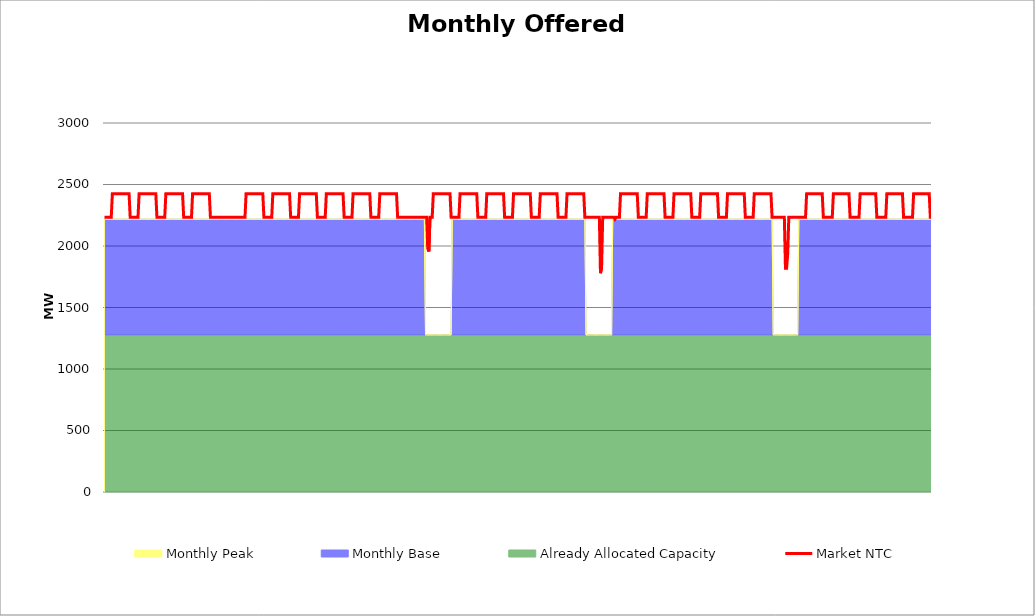
| Category | Market NTC |
|---|---|
| 0 | 2233 |
| 1 | 2233 |
| 2 | 2233 |
| 3 | 2233 |
| 4 | 2233 |
| 5 | 2233 |
| 6 | 2233 |
| 7 | 2425 |
| 8 | 2425 |
| 9 | 2425 |
| 10 | 2425 |
| 11 | 2425 |
| 12 | 2425 |
| 13 | 2425 |
| 14 | 2425 |
| 15 | 2425 |
| 16 | 2425 |
| 17 | 2425 |
| 18 | 2425 |
| 19 | 2425 |
| 20 | 2425 |
| 21 | 2425 |
| 22 | 2425 |
| 23 | 2233 |
| 24 | 2233 |
| 25 | 2233 |
| 26 | 2233 |
| 27 | 2233 |
| 28 | 2233 |
| 29 | 2233 |
| 30 | 2233 |
| 31 | 2425 |
| 32 | 2425 |
| 33 | 2425 |
| 34 | 2425 |
| 35 | 2425 |
| 36 | 2425 |
| 37 | 2425 |
| 38 | 2425 |
| 39 | 2425 |
| 40 | 2425 |
| 41 | 2425 |
| 42 | 2425 |
| 43 | 2425 |
| 44 | 2425 |
| 45 | 2425 |
| 46 | 2425 |
| 47 | 2233 |
| 48 | 2233 |
| 49 | 2233 |
| 50 | 2233 |
| 51 | 2233 |
| 52 | 2233 |
| 53 | 2233 |
| 54 | 2233 |
| 55 | 2425 |
| 56 | 2425 |
| 57 | 2425 |
| 58 | 2425 |
| 59 | 2425 |
| 60 | 2425 |
| 61 | 2425 |
| 62 | 2425 |
| 63 | 2425 |
| 64 | 2425 |
| 65 | 2425 |
| 66 | 2425 |
| 67 | 2425 |
| 68 | 2425 |
| 69 | 2425 |
| 70 | 2425 |
| 71 | 2233 |
| 72 | 2233 |
| 73 | 2233 |
| 74 | 2233 |
| 75 | 2233 |
| 76 | 2233 |
| 77 | 2233 |
| 78 | 2233 |
| 79 | 2425 |
| 80 | 2425 |
| 81 | 2425 |
| 82 | 2425 |
| 83 | 2425 |
| 84 | 2425 |
| 85 | 2425 |
| 86 | 2425 |
| 87 | 2425 |
| 88 | 2425 |
| 89 | 2425 |
| 90 | 2425 |
| 91 | 2425 |
| 92 | 2425 |
| 93 | 2425 |
| 94 | 2425 |
| 95 | 2233 |
| 96 | 2233 |
| 97 | 2233 |
| 98 | 2233 |
| 99 | 2233 |
| 100 | 2233 |
| 101 | 2233 |
| 102 | 2233 |
| 103 | 2233 |
| 104 | 2233 |
| 105 | 2233 |
| 106 | 2233 |
| 107 | 2233 |
| 108 | 2233 |
| 109 | 2233 |
| 110 | 2233 |
| 111 | 2233 |
| 112 | 2233 |
| 113 | 2233 |
| 114 | 2233 |
| 115 | 2233 |
| 116 | 2233 |
| 117 | 2233 |
| 118 | 2233 |
| 119 | 2233 |
| 120 | 2233 |
| 121 | 2233 |
| 122 | 2233 |
| 123 | 2233 |
| 124 | 2233 |
| 125 | 2233 |
| 126 | 2233 |
| 127 | 2425 |
| 128 | 2425 |
| 129 | 2425 |
| 130 | 2425 |
| 131 | 2425 |
| 132 | 2425 |
| 133 | 2425 |
| 134 | 2425 |
| 135 | 2425 |
| 136 | 2425 |
| 137 | 2425 |
| 138 | 2425 |
| 139 | 2425 |
| 140 | 2425 |
| 141 | 2425 |
| 142 | 2425 |
| 143 | 2233 |
| 144 | 2233 |
| 145 | 2233 |
| 146 | 2233 |
| 147 | 2233 |
| 148 | 2233 |
| 149 | 2233 |
| 150 | 2233 |
| 151 | 2425 |
| 152 | 2425 |
| 153 | 2425 |
| 154 | 2425 |
| 155 | 2425 |
| 156 | 2425 |
| 157 | 2425 |
| 158 | 2425 |
| 159 | 2425 |
| 160 | 2425 |
| 161 | 2425 |
| 162 | 2425 |
| 163 | 2425 |
| 164 | 2425 |
| 165 | 2425 |
| 166 | 2425 |
| 167 | 2233 |
| 168 | 2233 |
| 169 | 2233 |
| 170 | 2233 |
| 171 | 2233 |
| 172 | 2233 |
| 173 | 2233 |
| 174 | 2233 |
| 175 | 2425 |
| 176 | 2425 |
| 177 | 2425 |
| 178 | 2425 |
| 179 | 2425 |
| 180 | 2425 |
| 181 | 2425 |
| 182 | 2425 |
| 183 | 2425 |
| 184 | 2425 |
| 185 | 2425 |
| 186 | 2425 |
| 187 | 2425 |
| 188 | 2425 |
| 189 | 2425 |
| 190 | 2425 |
| 191 | 2233 |
| 192 | 2233 |
| 193 | 2233 |
| 194 | 2233 |
| 195 | 2233 |
| 196 | 2233 |
| 197 | 2233 |
| 198 | 2233 |
| 199 | 2425 |
| 200 | 2425 |
| 201 | 2425 |
| 202 | 2425 |
| 203 | 2425 |
| 204 | 2425 |
| 205 | 2425 |
| 206 | 2425 |
| 207 | 2425 |
| 208 | 2425 |
| 209 | 2425 |
| 210 | 2425 |
| 211 | 2425 |
| 212 | 2425 |
| 213 | 2425 |
| 214 | 2425 |
| 215 | 2233 |
| 216 | 2233 |
| 217 | 2233 |
| 218 | 2233 |
| 219 | 2233 |
| 220 | 2233 |
| 221 | 2233 |
| 222 | 2233 |
| 223 | 2425 |
| 224 | 2425 |
| 225 | 2425 |
| 226 | 2425 |
| 227 | 2425 |
| 228 | 2425 |
| 229 | 2425 |
| 230 | 2425 |
| 231 | 2425 |
| 232 | 2425 |
| 233 | 2425 |
| 234 | 2425 |
| 235 | 2425 |
| 236 | 2425 |
| 237 | 2425 |
| 238 | 2425 |
| 239 | 2233 |
| 240 | 2233 |
| 241 | 2233 |
| 242 | 2233 |
| 243 | 2233 |
| 244 | 2233 |
| 245 | 2233 |
| 246 | 2233 |
| 247 | 2425 |
| 248 | 2425 |
| 249 | 2425 |
| 250 | 2425 |
| 251 | 2425 |
| 252 | 2425 |
| 253 | 2425 |
| 254 | 2425 |
| 255 | 2425 |
| 256 | 2425 |
| 257 | 2425 |
| 258 | 2425 |
| 259 | 2425 |
| 260 | 2425 |
| 261 | 2425 |
| 262 | 2425 |
| 263 | 2233 |
| 264 | 2233 |
| 265 | 2233 |
| 266 | 2233 |
| 267 | 2233 |
| 268 | 2233 |
| 269 | 2233 |
| 270 | 2233 |
| 271 | 2233 |
| 272 | 2233 |
| 273 | 2233 |
| 274 | 2233 |
| 275 | 2233 |
| 276 | 2233 |
| 277 | 2233 |
| 278 | 2233 |
| 279 | 2233 |
| 280 | 2233 |
| 281 | 2233 |
| 282 | 2233 |
| 283 | 2233 |
| 284 | 2233 |
| 285 | 2233 |
| 286 | 2233 |
| 287 | 2233 |
| 288 | 2233 |
| 289 | 2233 |
| 290 | 1981 |
| 291 | 1955 |
| 292 | 2233 |
| 293 | 2233 |
| 294 | 2233 |
| 295 | 2425 |
| 296 | 2425 |
| 297 | 2425 |
| 298 | 2425 |
| 299 | 2425 |
| 300 | 2425 |
| 301 | 2425 |
| 302 | 2425 |
| 303 | 2425 |
| 304 | 2425 |
| 305 | 2425 |
| 306 | 2425 |
| 307 | 2425 |
| 308 | 2425 |
| 309 | 2425 |
| 310 | 2425 |
| 311 | 2233 |
| 312 | 2233 |
| 313 | 2233 |
| 314 | 2233 |
| 315 | 2233 |
| 316 | 2233 |
| 317 | 2233 |
| 318 | 2233 |
| 319 | 2425 |
| 320 | 2425 |
| 321 | 2425 |
| 322 | 2425 |
| 323 | 2425 |
| 324 | 2425 |
| 325 | 2425 |
| 326 | 2425 |
| 327 | 2425 |
| 328 | 2425 |
| 329 | 2425 |
| 330 | 2425 |
| 331 | 2425 |
| 332 | 2425 |
| 333 | 2425 |
| 334 | 2425 |
| 335 | 2233 |
| 336 | 2233 |
| 337 | 2233 |
| 338 | 2233 |
| 339 | 2233 |
| 340 | 2233 |
| 341 | 2233 |
| 342 | 2233 |
| 343 | 2425 |
| 344 | 2425 |
| 345 | 2425 |
| 346 | 2425 |
| 347 | 2425 |
| 348 | 2425 |
| 349 | 2425 |
| 350 | 2425 |
| 351 | 2425 |
| 352 | 2425 |
| 353 | 2425 |
| 354 | 2425 |
| 355 | 2425 |
| 356 | 2425 |
| 357 | 2425 |
| 358 | 2425 |
| 359 | 2233 |
| 360 | 2233 |
| 361 | 2233 |
| 362 | 2233 |
| 363 | 2233 |
| 364 | 2233 |
| 365 | 2233 |
| 366 | 2233 |
| 367 | 2425 |
| 368 | 2425 |
| 369 | 2425 |
| 370 | 2425 |
| 371 | 2425 |
| 372 | 2425 |
| 373 | 2425 |
| 374 | 2425 |
| 375 | 2425 |
| 376 | 2425 |
| 377 | 2425 |
| 378 | 2425 |
| 379 | 2425 |
| 380 | 2425 |
| 381 | 2425 |
| 382 | 2425 |
| 383 | 2233 |
| 384 | 2233 |
| 385 | 2233 |
| 386 | 2233 |
| 387 | 2233 |
| 388 | 2233 |
| 389 | 2233 |
| 390 | 2233 |
| 391 | 2425 |
| 392 | 2425 |
| 393 | 2425 |
| 394 | 2425 |
| 395 | 2425 |
| 396 | 2425 |
| 397 | 2425 |
| 398 | 2425 |
| 399 | 2425 |
| 400 | 2425 |
| 401 | 2425 |
| 402 | 2425 |
| 403 | 2425 |
| 404 | 2425 |
| 405 | 2425 |
| 406 | 2425 |
| 407 | 2233 |
| 408 | 2233 |
| 409 | 2233 |
| 410 | 2233 |
| 411 | 2233 |
| 412 | 2233 |
| 413 | 2233 |
| 414 | 2233 |
| 415 | 2425 |
| 416 | 2425 |
| 417 | 2425 |
| 418 | 2425 |
| 419 | 2425 |
| 420 | 2425 |
| 421 | 2425 |
| 422 | 2425 |
| 423 | 2425 |
| 424 | 2425 |
| 425 | 2425 |
| 426 | 2425 |
| 427 | 2425 |
| 428 | 2425 |
| 429 | 2425 |
| 430 | 2425 |
| 431 | 2233 |
| 432 | 2233 |
| 433 | 2233 |
| 434 | 2233 |
| 435 | 2233 |
| 436 | 2233 |
| 437 | 2233 |
| 438 | 2233 |
| 439 | 2233 |
| 440 | 2233 |
| 441 | 2233 |
| 442 | 2233 |
| 443 | 2233 |
| 444 | 2233 |
| 445 | 1779 |
| 446 | 1826 |
| 447 | 2233 |
| 448 | 2233 |
| 449 | 2233 |
| 450 | 2233 |
| 451 | 2233 |
| 452 | 2233 |
| 453 | 2233 |
| 454 | 2233 |
| 455 | 2233 |
| 456 | 2233 |
| 457 | 2233 |
| 458 | 2218 |
| 459 | 2233 |
| 460 | 2233 |
| 461 | 2233 |
| 462 | 2233 |
| 463 | 2425 |
| 464 | 2425 |
| 465 | 2425 |
| 466 | 2425 |
| 467 | 2425 |
| 468 | 2425 |
| 469 | 2425 |
| 470 | 2425 |
| 471 | 2425 |
| 472 | 2425 |
| 473 | 2425 |
| 474 | 2425 |
| 475 | 2425 |
| 476 | 2425 |
| 477 | 2425 |
| 478 | 2425 |
| 479 | 2233 |
| 480 | 2233 |
| 481 | 2233 |
| 482 | 2233 |
| 483 | 2233 |
| 484 | 2233 |
| 485 | 2233 |
| 486 | 2233 |
| 487 | 2425 |
| 488 | 2425 |
| 489 | 2425 |
| 490 | 2425 |
| 491 | 2425 |
| 492 | 2425 |
| 493 | 2425 |
| 494 | 2425 |
| 495 | 2425 |
| 496 | 2425 |
| 497 | 2425 |
| 498 | 2425 |
| 499 | 2425 |
| 500 | 2425 |
| 501 | 2425 |
| 502 | 2425 |
| 503 | 2233 |
| 504 | 2233 |
| 505 | 2233 |
| 506 | 2233 |
| 507 | 2233 |
| 508 | 2233 |
| 509 | 2233 |
| 510 | 2233 |
| 511 | 2425 |
| 512 | 2425 |
| 513 | 2425 |
| 514 | 2425 |
| 515 | 2425 |
| 516 | 2425 |
| 517 | 2425 |
| 518 | 2425 |
| 519 | 2425 |
| 520 | 2425 |
| 521 | 2425 |
| 522 | 2425 |
| 523 | 2425 |
| 524 | 2425 |
| 525 | 2425 |
| 526 | 2425 |
| 527 | 2233 |
| 528 | 2233 |
| 529 | 2233 |
| 530 | 2233 |
| 531 | 2233 |
| 532 | 2233 |
| 533 | 2233 |
| 534 | 2233 |
| 535 | 2425 |
| 536 | 2425 |
| 537 | 2425 |
| 538 | 2425 |
| 539 | 2425 |
| 540 | 2425 |
| 541 | 2425 |
| 542 | 2425 |
| 543 | 2425 |
| 544 | 2425 |
| 545 | 2425 |
| 546 | 2425 |
| 547 | 2425 |
| 548 | 2425 |
| 549 | 2425 |
| 550 | 2425 |
| 551 | 2233 |
| 552 | 2233 |
| 553 | 2233 |
| 554 | 2233 |
| 555 | 2233 |
| 556 | 2233 |
| 557 | 2233 |
| 558 | 2233 |
| 559 | 2425 |
| 560 | 2425 |
| 561 | 2425 |
| 562 | 2425 |
| 563 | 2425 |
| 564 | 2425 |
| 565 | 2425 |
| 566 | 2425 |
| 567 | 2425 |
| 568 | 2425 |
| 569 | 2425 |
| 570 | 2425 |
| 571 | 2425 |
| 572 | 2425 |
| 573 | 2425 |
| 574 | 2425 |
| 575 | 2233 |
| 576 | 2233 |
| 577 | 2233 |
| 578 | 2233 |
| 579 | 2233 |
| 580 | 2233 |
| 581 | 2233 |
| 582 | 2233 |
| 583 | 2425 |
| 584 | 2425 |
| 585 | 2425 |
| 586 | 2425 |
| 587 | 2425 |
| 588 | 2425 |
| 589 | 2425 |
| 590 | 2425 |
| 591 | 2425 |
| 592 | 2425 |
| 593 | 2425 |
| 594 | 2425 |
| 595 | 2425 |
| 596 | 2425 |
| 597 | 2425 |
| 598 | 2425 |
| 599 | 2233 |
| 600 | 2233 |
| 601 | 2233 |
| 602 | 2233 |
| 603 | 2233 |
| 604 | 2233 |
| 605 | 2233 |
| 606 | 2233 |
| 607 | 2233 |
| 608 | 2233 |
| 609 | 2233 |
| 610 | 2233 |
| 611 | 1819 |
| 612 | 1819 |
| 613 | 1932 |
| 614 | 2233 |
| 615 | 2233 |
| 616 | 2233 |
| 617 | 2233 |
| 618 | 2233 |
| 619 | 2233 |
| 620 | 2233 |
| 621 | 2233 |
| 622 | 2233 |
| 623 | 2233 |
| 624 | 2233 |
| 625 | 2233 |
| 626 | 2233 |
| 627 | 2233 |
| 628 | 2233 |
| 629 | 2233 |
| 630 | 2425 |
| 631 | 2425 |
| 632 | 2425 |
| 633 | 2425 |
| 634 | 2425 |
| 635 | 2425 |
| 636 | 2425 |
| 637 | 2425 |
| 638 | 2425 |
| 639 | 2425 |
| 640 | 2425 |
| 641 | 2425 |
| 642 | 2425 |
| 643 | 2425 |
| 644 | 2425 |
| 645 | 2233 |
| 646 | 2233 |
| 647 | 2233 |
| 648 | 2233 |
| 649 | 2233 |
| 650 | 2233 |
| 651 | 2233 |
| 652 | 2233 |
| 653 | 2233 |
| 654 | 2425 |
| 655 | 2425 |
| 656 | 2425 |
| 657 | 2425 |
| 658 | 2425 |
| 659 | 2425 |
| 660 | 2425 |
| 661 | 2425 |
| 662 | 2425 |
| 663 | 2425 |
| 664 | 2425 |
| 665 | 2425 |
| 666 | 2425 |
| 667 | 2425 |
| 668 | 2425 |
| 669 | 2233 |
| 670 | 2233 |
| 671 | 2233 |
| 672 | 2233 |
| 673 | 2233 |
| 674 | 2233 |
| 675 | 2233 |
| 676 | 2233 |
| 677 | 2233 |
| 678 | 2425 |
| 679 | 2425 |
| 680 | 2425 |
| 681 | 2425 |
| 682 | 2425 |
| 683 | 2425 |
| 684 | 2425 |
| 685 | 2425 |
| 686 | 2425 |
| 687 | 2425 |
| 688 | 2425 |
| 689 | 2425 |
| 690 | 2425 |
| 691 | 2425 |
| 692 | 2425 |
| 693 | 2233 |
| 694 | 2233 |
| 695 | 2233 |
| 696 | 2233 |
| 697 | 2233 |
| 698 | 2233 |
| 699 | 2233 |
| 700 | 2233 |
| 701 | 2233 |
| 702 | 2425 |
| 703 | 2425 |
| 704 | 2425 |
| 705 | 2425 |
| 706 | 2425 |
| 707 | 2425 |
| 708 | 2425 |
| 709 | 2425 |
| 710 | 2425 |
| 711 | 2425 |
| 712 | 2425 |
| 713 | 2425 |
| 714 | 2425 |
| 715 | 2425 |
| 716 | 2425 |
| 717 | 2233 |
| 718 | 2233 |
| 719 | 2233 |
| 720 | 2233 |
| 721 | 2233 |
| 722 | 2233 |
| 723 | 2233 |
| 724 | 2233 |
| 725 | 2233 |
| 726 | 2425 |
| 727 | 2425 |
| 728 | 2425 |
| 729 | 2425 |
| 730 | 2425 |
| 731 | 2425 |
| 732 | 2425 |
| 733 | 2425 |
| 734 | 2425 |
| 735 | 2425 |
| 736 | 2425 |
| 737 | 2425 |
| 738 | 2425 |
| 739 | 2425 |
| 740 | 2425 |
| 741 | 2233 |
| 742 | 2233 |